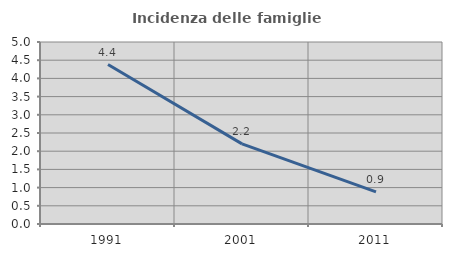
| Category | Incidenza delle famiglie numerose |
|---|---|
| 1991.0 | 4.381 |
| 2001.0 | 2.201 |
| 2011.0 | 0.884 |